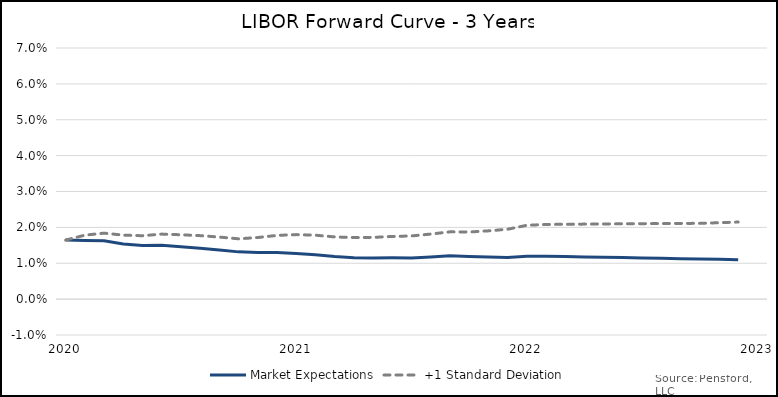
| Category | Market Expectations | +1 Standard Deviation |
|---|---|---|
| 2020-01-31 | 0.016 | 0.016 |
| 2020-02-29 | 0.016 | 0.018 |
| 2020-03-29 | 0.016 | 0.018 |
| 2020-04-29 | 0.015 | 0.018 |
| 2020-05-29 | 0.015 | 0.018 |
| 2020-06-29 | 0.015 | 0.018 |
| 2020-07-29 | 0.015 | 0.018 |
| 2020-08-29 | 0.014 | 0.018 |
| 2020-09-29 | 0.014 | 0.017 |
| 2020-10-29 | 0.013 | 0.017 |
| 2020-11-29 | 0.013 | 0.017 |
| 2020-12-29 | 0.013 | 0.018 |
| 2021-01-29 | 0.013 | 0.018 |
| 2021-02-28 | 0.012 | 0.018 |
| 2021-03-28 | 0.012 | 0.017 |
| 2021-04-28 | 0.012 | 0.017 |
| 2021-05-28 | 0.011 | 0.017 |
| 2021-06-28 | 0.012 | 0.017 |
| 2021-07-28 | 0.011 | 0.018 |
| 2021-08-28 | 0.012 | 0.018 |
| 2021-09-28 | 0.012 | 0.019 |
| 2021-10-28 | 0.012 | 0.019 |
| 2021-11-28 | 0.012 | 0.019 |
| 2021-12-28 | 0.012 | 0.019 |
| 2022-01-28 | 0.012 | 0.021 |
| 2022-02-28 | 0.012 | 0.021 |
| 2022-03-28 | 0.012 | 0.021 |
| 2022-04-28 | 0.012 | 0.021 |
| 2022-05-28 | 0.012 | 0.021 |
| 2022-06-28 | 0.012 | 0.021 |
| 2022-07-28 | 0.011 | 0.021 |
| 2022-08-28 | 0.011 | 0.021 |
| 2022-09-28 | 0.011 | 0.021 |
| 2022-10-28 | 0.011 | 0.021 |
| 2022-11-28 | 0.011 | 0.021 |
| 2022-12-28 | 0.011 | 0.021 |
| 2023-01-28 | 0.012 | 0.023 |
| 2023-02-28 | 0.012 | 0.024 |
| 2023-03-28 | 0.012 | 0.024 |
| 2023-04-28 | 0.012 | 0.024 |
| 2023-05-28 | 0.012 | 0.024 |
| 2023-06-28 | 0.012 | 0.024 |
| 2023-07-28 | 0.012 | 0.024 |
| 2023-08-28 | 0.012 | 0.025 |
| 2023-09-28 | 0.012 | 0.025 |
| 2023-10-28 | 0.012 | 0.025 |
| 2023-11-28 | 0.012 | 0.025 |
| 2023-12-28 | 0.012 | 0.025 |
| 2024-01-28 | 0.013 | 0.026 |
| 2024-02-28 | 0.013 | 0.027 |
| 2024-03-28 | 0.013 | 0.027 |
| 2024-04-28 | 0.013 | 0.027 |
| 2024-05-28 | 0.013 | 0.027 |
| 2024-06-28 | 0.013 | 0.027 |
| 2024-07-28 | 0.013 | 0.028 |
| 2024-08-28 | 0.013 | 0.028 |
| 2024-09-28 | 0.013 | 0.028 |
| 2024-10-28 | 0.013 | 0.028 |
| 2024-11-28 | 0.013 | 0.028 |
| 2024-12-28 | 0.013 | 0.028 |
| 2025-01-28 | 0.013 | 0.029 |
| 2025-02-28 | 0.014 | 0.03 |
| 2025-03-28 | 0.014 | 0.03 |
| 2025-04-28 | 0.014 | 0.03 |
| 2025-05-28 | 0.014 | 0.03 |
| 2025-06-28 | 0.014 | 0.031 |
| 2025-07-28 | 0.014 | 0.031 |
| 2025-08-28 | 0.014 | 0.031 |
| 2025-09-28 | 0.014 | 0.031 |
| 2025-10-28 | 0.014 | 0.031 |
| 2025-11-28 | 0.014 | 0.032 |
| 2025-12-28 | 0.014 | 0.032 |
| 2026-01-28 | 0.014 | 0.032 |
| 2026-02-28 | 0.014 | 0.033 |
| 2026-03-28 | 0.014 | 0.033 |
| 2026-04-28 | 0.014 | 0.033 |
| 2026-05-28 | 0.014 | 0.033 |
| 2026-06-28 | 0.014 | 0.033 |
| 2026-07-28 | 0.014 | 0.034 |
| 2026-08-28 | 0.014 | 0.034 |
| 2026-09-28 | 0.014 | 0.034 |
| 2026-10-28 | 0.015 | 0.034 |
| 2026-11-28 | 0.015 | 0.034 |
| 2026-12-28 | 0.015 | 0.034 |
| 2027-01-28 | 0.015 | 0.035 |
| 2027-02-28 | 0.015 | 0.035 |
| 2027-03-28 | 0.015 | 0.035 |
| 2027-04-28 | 0.015 | 0.036 |
| 2027-05-28 | 0.015 | 0.036 |
| 2027-06-28 | 0.015 | 0.036 |
| 2027-07-28 | 0.015 | 0.036 |
| 2027-08-28 | 0.015 | 0.036 |
| 2027-09-28 | 0.015 | 0.037 |
| 2027-10-28 | 0.015 | 0.037 |
| 2027-11-28 | 0.015 | 0.037 |
| 2027-12-28 | 0.015 | 0.037 |
| 2028-01-28 | 0.016 | 0.038 |
| 2028-02-28 | 0.016 | 0.038 |
| 2028-03-28 | 0.016 | 0.038 |
| 2028-04-28 | 0.016 | 0.038 |
| 2028-05-28 | 0.016 | 0.038 |
| 2028-06-28 | 0.016 | 0.039 |
| 2028-07-28 | 0.016 | 0.039 |
| 2028-08-28 | 0.016 | 0.039 |
| 2028-09-28 | 0.016 | 0.039 |
| 2028-10-28 | 0.016 | 0.039 |
| 2028-11-28 | 0.016 | 0.039 |
| 2028-12-28 | 0.016 | 0.039 |
| 2029-01-28 | 0.016 | 0.04 |
| 2029-02-28 | 0.016 | 0.04 |
| 2029-03-28 | 0.016 | 0.04 |
| 2029-04-28 | 0.016 | 0.04 |
| 2029-05-28 | 0.017 | 0.04 |
| 2029-06-28 | 0.017 | 0.041 |
| 2029-07-28 | 0.017 | 0.041 |
| 2029-08-28 | 0.017 | 0.041 |
| 2029-09-28 | 0.017 | 0.041 |
| 2029-10-28 | 0.017 | 0.041 |
| 2029-11-28 | 0.017 | 0.042 |
| 2029-12-28 | 0.017 | 0.042 |